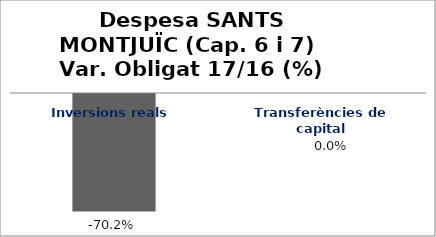
| Category | Series 0 |
|---|---|
| Inversions reals | -0.702 |
| Transferències de capital | 0 |